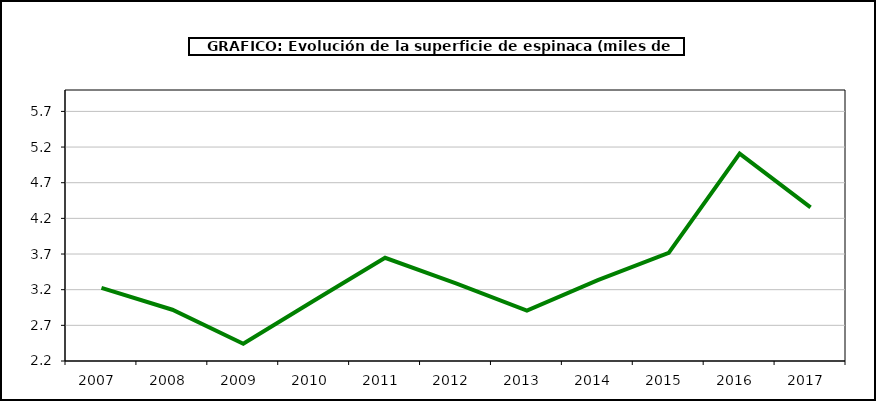
| Category | superficie |
|---|---|
| 2007.0 | 3.225 |
| 2008.0 | 2.919 |
| 2009.0 | 2.441 |
| 2010.0 | 3.049 |
| 2011.0 | 3.647 |
| 2012.0 | 3.289 |
| 2013.0 | 2.908 |
| 2014.0 | 3.335 |
| 2015.0 | 3.717 |
| 2016.0 | 5.108 |
| 2017.0 | 4.353 |